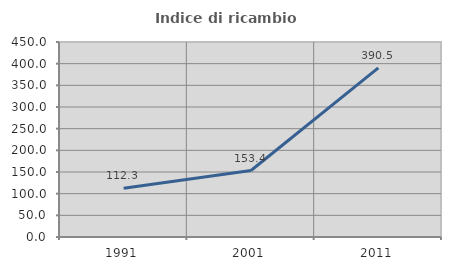
| Category | Indice di ricambio occupazionale  |
|---|---|
| 1991.0 | 112.346 |
| 2001.0 | 153.39 |
| 2011.0 | 390.476 |